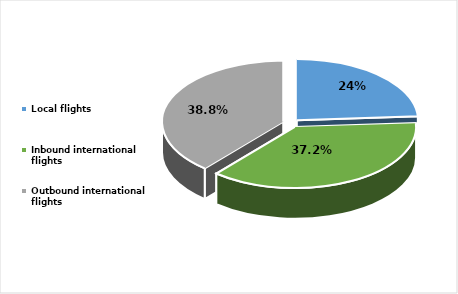
| Category | Series 0 |
|---|---|
| Local flights  | 0.24 |
| Inbound international flights  | 0.372 |
| Outbound international flights  | 0.388 |